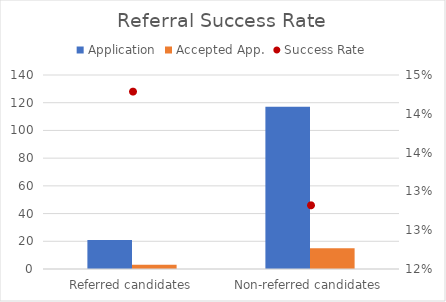
| Category | Application | Accepted App. |
|---|---|---|
| Referred candidates | 21 | 3 |
| Non-referred candidates | 117 | 15 |